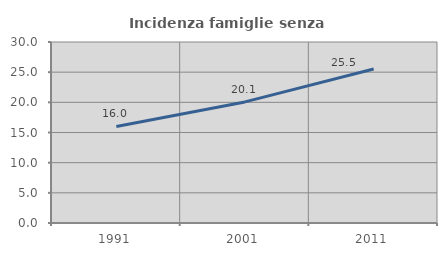
| Category | Incidenza famiglie senza nuclei |
|---|---|
| 1991.0 | 16 |
| 2001.0 | 20.07 |
| 2011.0 | 25.516 |